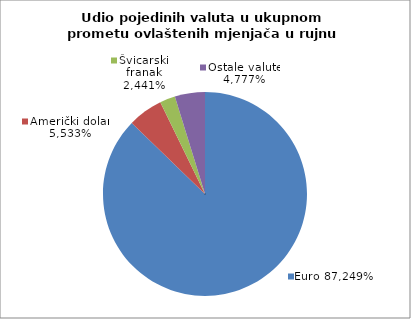
| Category | EUR |
|---|---|
| 0 | 0.872 |
| 1 | 0.055 |
| 2 | 0.024 |
| 3 | 0.048 |